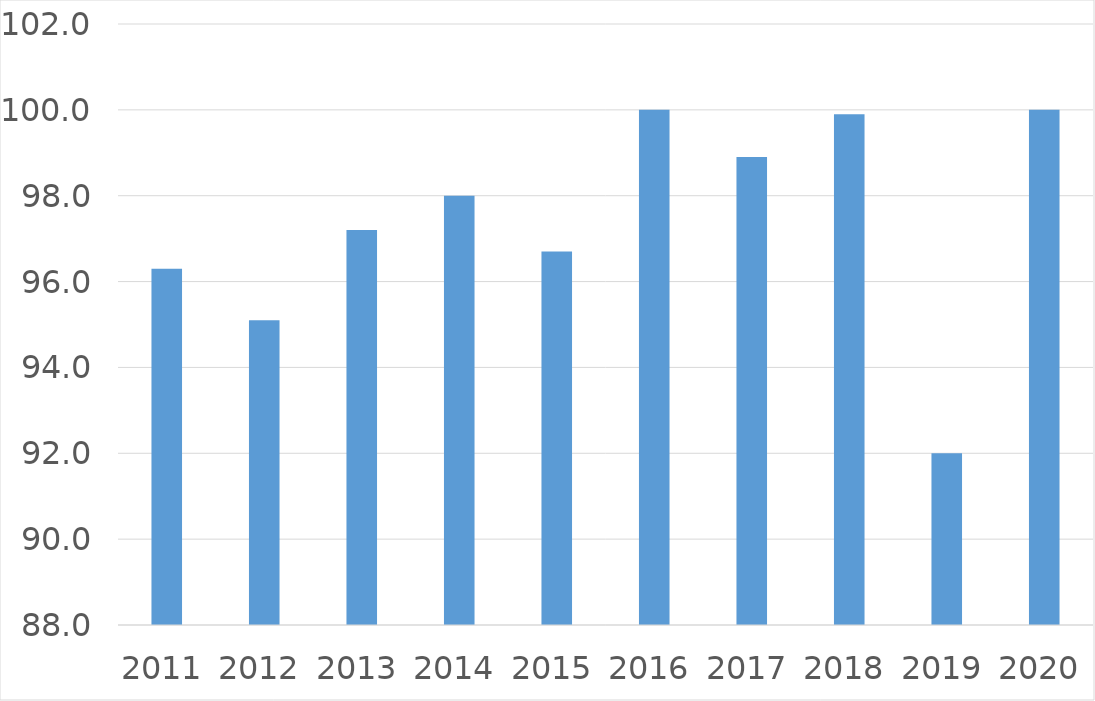
| Category | Series 0 |
|---|---|
| 2011 | 96.3 |
| 2012 | 95.1 |
| 2013 | 97.2 |
| 2014 | 98 |
| 2015 | 96.7 |
| 2016 | 100 |
| 2017 | 98.9 |
| 2018 | 99.9 |
| 2019 | 92 |
| 2020 | 100 |